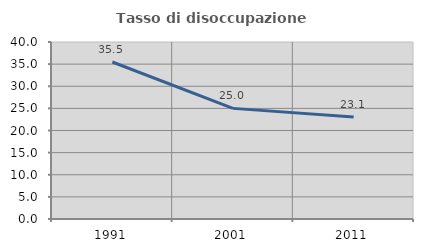
| Category | Tasso di disoccupazione giovanile  |
|---|---|
| 1991.0 | 35.484 |
| 2001.0 | 25 |
| 2011.0 | 23.077 |